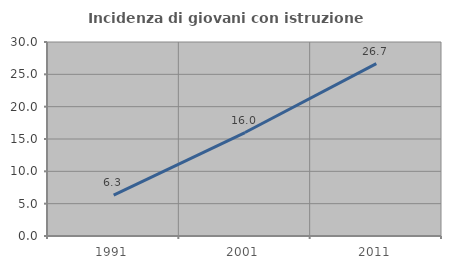
| Category | Incidenza di giovani con istruzione universitaria |
|---|---|
| 1991.0 | 6.311 |
| 2001.0 | 16 |
| 2011.0 | 26.667 |